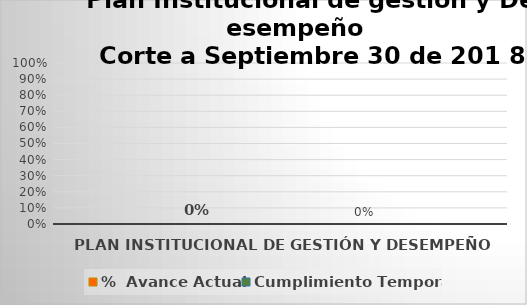
| Category | %  Avance Actual | Cumplimiento Temporal |
|---|---|---|
| PLAN INSTITUCIONAL DE GESTIÓN Y DESEMPEÑO | 0 | 0 |